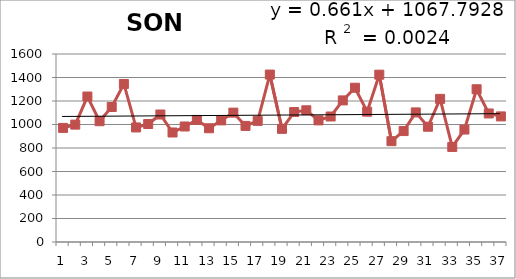
| Category | 1976-2012 |
|---|---|
| 0 | 971 |
| 1 | 999 |
| 2 | 1238 |
| 3 | 1028 |
| 4 | 1149 |
| 5 | 1345 |
| 6 | 975 |
| 7 | 1004 |
| 8 | 1085 |
| 9 | 932 |
| 10 | 983 |
| 11 | 1039 |
| 12 | 968 |
| 13 | 1035 |
| 14 | 1101 |
| 15 | 988 |
| 16 | 1031 |
| 17 | 1425 |
| 18 | 963 |
| 19 | 1106 |
| 20 | 1121 |
| 21 | 1035 |
| 22 | 1068 |
| 23 | 1205 |
| 24 | 1313 |
| 25 | 1109 |
| 26 | 1424 |
| 27 | 858 |
| 28 | 944 |
| 29 | 1103 |
| 30 | 981 |
| 31 | 1218 |
| 32 | 809 |
| 33 | 957 |
| 34 | 1300 |
| 35 | 1094 |
| 36 | 1069 |